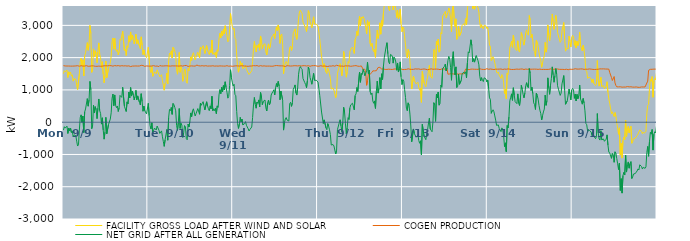
| Category | FACILITY GROSS LOAD AFTER WIND AND SOLAR | COGEN PRODUCTION | NET GRID AFTER ALL GENERATION |
|---|---|---|---|
|  Mon  9/9 | 1505 | 1752 | -247 |
|  Mon  9/9 | 1597 | 1737 | -140 |
|  Mon  9/9 | 1559 | 1742 | -183 |
|  Mon  9/9 | 1580 | 1735 | -155 |
|  Mon  9/9 | 1617 | 1740 | -123 |
|  Mon  9/9 | 1384 | 1734 | -350 |
|  Mon  9/9 | 1560 | 1740 | -180 |
|  Mon  9/9 | 1480 | 1748 | -268 |
|  Mon  9/9 | 1556 | 1737 | -181 |
|  Mon  9/9 | 1427 | 1748 | -321 |
|  Mon  9/9 | 1467 | 1737 | -270 |
|  Mon  9/9 | 1272 | 1729 | -457 |
|  Mon  9/9 | 1346 | 1739 | -393 |
|  Mon  9/9 | 1343 | 1721 | -378 |
|  Mon  9/9 | 1325 | 1743 | -418 |
|  Mon  9/9 | 1149 | 1737 | -588 |
|  Mon  9/9 | 1011 | 1750 | -739 |
|  Mon  9/9 | 1038 | 1740 | -702 |
|  Mon  9/9 | 1491 | 1734 | -243 |
|  Mon  9/9 | 1881 | 1737 | 144 |
|  Mon  9/9 | 1977 | 1750 | 227 |
|  Mon  9/9 | 1741 | 1746 | -5 |
|  Mon  9/9 | 1930 | 1738 | 192 |
|  Mon  9/9 | 1431 | 1752 | -321 |
|  Mon  9/9 | 2055 | 1740 | 315 |
|  Mon  9/9 | 2149 | 1740 | 409 |
|  Mon  9/9 | 2135 | 1752 | 383 |
|  Mon  9/9 | 2465 | 1736 | 729 |
|  Mon  9/9 | 2228 | 1732 | 496 |
|  Mon  9/9 | 2437 | 1739 | 698 |
|  Mon  9/9 | 2999 | 1736 | 1263 |
|  Mon  9/9 | 2750 | 1746 | 1004 |
|  Mon  9/9 | 1543 | 1746 | -203 |
|  Mon  9/9 | 1649 | 1741 | -92 |
|  Mon  9/9 | 2272 | 1744 | 528 |
|  Mon  9/9 | 2021 | 1737 | 284 |
|  Mon  9/9 | 2213 | 1732 | 481 |
|  Mon  9/9 | 2127 | 1741 | 386 |
|  Mon  9/9 | 1841 | 1731 | 110 |
|  Mon  9/9 | 2187 | 1751 | 436 |
|  Mon  9/9 | 2457 | 1738 | 719 |
|  Mon  9/9 | 2112 | 1756 | 356 |
|  Mon  9/9 | 2006 | 1733 | 273 |
|  Mon  9/9 | 1687 | 1747 | -60 |
|  Mon  9/9 | 1873 | 1737 | 136 |
|  Mon  9/9 | 1488 | 1735 | -247 |
|  Mon  9/9 | 1221 | 1747 | -526 |
|  Mon  9/9 | 1447 | 1754 | -307 |
|  Mon  9/9 | 1897 | 1748 | 149 |
|  Mon  9/9 | 1380 | 1740 | -360 |
|  Mon  9/9 | 1391 | 1746 | -355 |
|  Mon  9/9 | 1670 | 1741 | -71 |
|  Mon  9/9 | 1684 | 1753 | -69 |
|  Mon  9/9 | 1839 | 1742 | 97 |
|  Mon  9/9 | 2042 | 1751 | 291 |
|  Mon  9/9 | 2497 | 1755 | 742 |
|  Mon  9/9 | 2607 | 1736 | 871 |
|  Mon  9/9 | 2261 | 1750 | 511 |
|  Mon  9/9 | 2598 | 1754 | 844 |
|  Mon  9/9 | 2259 | 1737 | 522 |
|  Mon  9/9 | 2195 | 1745 | 450 |
|  Mon  9/9 | 2244 | 1742 | 502 |
|  Mon  9/9 | 2084 | 1753 | 331 |
|  Mon  9/9 | 2188 | 1740 | 448 |
|  Mon  9/9 | 2568 | 1739 | 829 |
|  Mon  9/9 | 2536 | 1733 | 803 |
|  Mon  9/9 | 2519 | 1751 | 768 |
|  Mon  9/9 | 2822 | 1742 | 1080 |
|  Mon  9/9 | 2830 | 1743 | 1087 |
|  Mon  9/9 | 2225 | 1735 | 490 |
|  Mon  9/9 | 2260 | 1747 | 513 |
|  Mon  9/9 | 2067 | 1736 | 331 |
|  Mon  9/9 | 2368 | 1739 | 629 |
|  Mon  9/9 | 2313 | 1745 | 568 |
|  Mon  9/9 | 2678 | 1745 | 933 |
|  Mon  9/9 | 2482 | 1732 | 750 |
|  Mon  9/9 | 2796 | 1723 | 1073 |
|  Mon  9/9 | 2544 | 1735 | 809 |
|  Mon  9/9 | 2701 | 1738 | 963 |
|  Mon  9/9 | 2591 | 1748 | 843 |
|  Mon  9/9 | 2429 | 1740 | 689 |
|  Mon  9/9 | 2542 | 1747 | 795 |
|  Mon  9/9 | 2729 | 1742 | 987 |
|  Mon  9/9 | 2431 | 1737 | 694 |
|  Mon  9/9 | 2554 | 1739 | 815 |
|  Mon  9/9 | 2534 | 1740 | 794 |
|  Mon  9/9 | 2358 | 1741 | 617 |
|  Mon  9/9 | 2278 | 1744 | 534 |
|  Mon  9/9 | 2644 | 1762 | 882 |
|  Mon  9/9 | 2382 | 1740 | 642 |
|  Mon  9/9 | 2095 | 1756 | 339 |
|  Mon  9/9 | 2241 | 1743 | 498 |
|  Mon  9/9 | 2082 | 1729 | 353 |
|  Mon  9/9 | 2111 | 1736 | 375 |
|  Mon  9/9 | 2001 | 1743 | 258 |
|  Mon  9/9 | 2017 | 1745 | 272 |
|  Tue  9/10 | 2322 | 1738 | 584 |
|  Tue  9/10 | 1935 | 1733 | 202 |
|  Tue  9/10 | 1636 | 1737 | -101 |
|  Tue  9/10 | 1539 | 1748 | -209 |
|  Tue  9/10 | 1722 | 1740 | -18 |
|  Tue  9/10 | 1423 | 1744 | -321 |
|  Tue  9/10 | 1496 | 1752 | -256 |
|  Tue  9/10 | 1561 | 1743 | -182 |
|  Tue  9/10 | 1554 | 1736 | -182 |
|  Tue  9/10 | 1501 | 1744 | -243 |
|  Tue  9/10 | 1621 | 1740 | -119 |
|  Tue  9/10 | 1611 | 1744 | -133 |
|  Tue  9/10 | 1475 | 1722 | -247 |
|  Tue  9/10 | 1407 | 1755 | -348 |
|  Tue  9/10 | 1413 | 1732 | -319 |
|  Tue  9/10 | 1471 | 1741 | -270 |
|  Tue  9/10 | 1289 | 1740 | -451 |
|  Tue  9/10 | 1146 | 1741 | -595 |
|  Tue  9/10 | 991 | 1740 | -749 |
|  Tue  9/10 | 1200 | 1746 | -546 |
|  Tue  9/10 | 1234 | 1753 | -519 |
|  Tue  9/10 | 1521 | 1747 | -226 |
|  Tue  9/10 | 1188 | 1746 | -558 |
|  Tue  9/10 | 1886 | 1741 | 145 |
|  Tue  9/10 | 2140 | 1745 | 395 |
|  Tue  9/10 | 2096 | 1737 | 359 |
|  Tue  9/10 | 2212 | 1756 | 456 |
|  Tue  9/10 | 1988 | 1746 | 242 |
|  Tue  9/10 | 2323 | 1742 | 581 |
|  Tue  9/10 | 2284 | 1743 | 541 |
|  Tue  9/10 | 2193 | 1737 | 456 |
|  Tue  9/10 | 2096 | 1744 | 352 |
|  Tue  9/10 | 1632 | 1730 | -98 |
|  Tue  9/10 | 1487 | 1741 | -254 |
|  Tue  9/10 | 1734 | 1740 | -6 |
|  Tue  9/10 | 2161 | 1738 | 423 |
|  Tue  9/10 | 1547 | 1739 | -192 |
|  Tue  9/10 | 1713 | 1748 | -35 |
|  Tue  9/10 | 1640 | 1733 | -93 |
|  Tue  9/10 | 1267 | 1738 | -471 |
|  Tue  9/10 | 1408 | 1738 | -330 |
|  Tue  9/10 | 1649 | 1754 | -105 |
|  Tue  9/10 | 1582 | 1728 | -146 |
|  Tue  9/10 | 1251 | 1758 | -507 |
|  Tue  9/10 | 1205 | 1751 | -546 |
|  Tue  9/10 | 1665 | 1726 | -61 |
|  Tue  9/10 | 1592 | 1739 | -147 |
|  Tue  9/10 | 1755 | 1740 | 15 |
|  Tue  9/10 | 2022 | 1736 | 286 |
|  Tue  9/10 | 1914 | 1744 | 170 |
|  Tue  9/10 | 2092 | 1750 | 342 |
|  Tue  9/10 | 2153 | 1739 | 414 |
|  Tue  9/10 | 2127 | 1734 | 393 |
|  Tue  9/10 | 1929 | 1738 | 191 |
|  Tue  9/10 | 2019 | 1757 | 262 |
|  Tue  9/10 | 2026 | 1769 | 257 |
|  Tue  9/10 | 2167 | 1745 | 422 |
|  Tue  9/10 | 2186 | 1748 | 438 |
|  Tue  9/10 | 1993 | 1748 | 245 |
|  Tue  9/10 | 2331 | 1742 | 589 |
|  Tue  9/10 | 2262 | 1736 | 526 |
|  Tue  9/10 | 2332 | 1751 | 581 |
|  Tue  9/10 | 2371 | 1736 | 635 |
|  Tue  9/10 | 2368 | 1740 | 628 |
|  Tue  9/10 | 2126 | 1746 | 380 |
|  Tue  9/10 | 2152 | 1750 | 402 |
|  Tue  9/10 | 2372 | 1740 | 632 |
|  Tue  9/10 | 2237 | 1738 | 499 |
|  Tue  9/10 | 2162 | 1744 | 418 |
|  Tue  9/10 | 2096 | 1741 | 355 |
|  Tue  9/10 | 2240 | 1735 | 505 |
|  Tue  9/10 | 2155 | 1740 | 415 |
|  Tue  9/10 | 2546 | 1743 | 803 |
|  Tue  9/10 | 2104 | 1748 | 356 |
|  Tue  9/10 | 2148 | 1735 | 413 |
|  Tue  9/10 | 2094 | 1737 | 357 |
|  Tue  9/10 | 2175 | 1742 | 433 |
|  Tue  9/10 | 2006 | 1741 | 265 |
|  Tue  9/10 | 2245 | 1739 | 506 |
|  Tue  9/10 | 2195 | 1737 | 458 |
|  Tue  9/10 | 2583 | 1739 | 844 |
|  Tue  9/10 | 2753 | 1744 | 1009 |
|  Tue  9/10 | 2614 | 1730 | 884 |
|  Tue  9/10 | 2820 | 1741 | 1079 |
|  Tue  9/10 | 2682 | 1740 | 942 |
|  Tue  9/10 | 2873 | 1738 | 1135 |
|  Tue  9/10 | 2743 | 1743 | 1000 |
|  Tue  9/10 | 2989 | 1737 | 1252 |
|  Tue  9/10 | 2812 | 1735 | 1077 |
|  Tue  9/10 | 2679 | 1751 | 928 |
|  Tue  9/10 | 2491 | 1747 | 744 |
|  Tue  9/10 | 2532 | 1734 | 798 |
|  Tue  9/10 | 2879 | 1747 | 1132 |
|  Tue  9/10 | 3366 | 1741 | 1625 |
|  Tue  9/10 | 3131 | 1754 | 1377 |
|  Tue  9/10 | 2972 | 1731 | 1241 |
|  Wed  9/11 | 2872 | 1752 | 1120 |
|  Wed  9/11 | 2914 | 1739 | 1175 |
|  Wed  9/11 | 2602 | 1739 | 863 |
|  Wed  9/11 | 2565 | 1746 | 819 |
|  Wed  9/11 | 2076 | 1745 | 331 |
|  Wed  9/11 | 1701 | 1744 | -43 |
|  Wed  9/11 | 1550 | 1743 | -193 |
|  Wed  9/11 | 1679 | 1739 | -60 |
|  Wed  9/11 | 1886 | 1737 | 149 |
|  Wed  9/11 | 1757 | 1746 | 11 |
|  Wed  9/11 | 1838 | 1744 | 94 |
|  Wed  9/11 | 1663 | 1747 | -84 |
|  Wed  9/11 | 1648 | 1747 | -99 |
|  Wed  9/11 | 1697 | 1740 | -43 |
|  Wed  9/11 | 1759 | 1742 | 17 |
|  Wed  9/11 | 1640 | 1736 | -96 |
|  Wed  9/11 | 1615 | 1736 | -121 |
|  Wed  9/11 | 1526 | 1731 | -205 |
|  Wed  9/11 | 1478 | 1751 | -273 |
|  Wed  9/11 | 1516 | 1739 | -223 |
|  Wed  9/11 | 1533 | 1742 | -209 |
|  Wed  9/11 | 1590 | 1741 | -151 |
|  Wed  9/11 | 1882 | 1738 | 144 |
|  Wed  9/11 | 2287 | 1752 | 535 |
|  Wed  9/11 | 2500 | 1735 | 765 |
|  Wed  9/11 | 2300 | 1747 | 553 |
|  Wed  9/11 | 2174 | 1741 | 433 |
|  Wed  9/11 | 2379 | 1754 | 625 |
|  Wed  9/11 | 2313 | 1728 | 585 |
|  Wed  9/11 | 2424 | 1734 | 690 |
|  Wed  9/11 | 2231 | 1758 | 473 |
|  Wed  9/11 | 2671 | 1752 | 919 |
|  Wed  9/11 | 2533 | 1753 | 780 |
|  Wed  9/11 | 2280 | 1738 | 542 |
|  Wed  9/11 | 2391 | 1749 | 642 |
|  Wed  9/11 | 2390 | 1745 | 645 |
|  Wed  9/11 | 2432 | 1745 | 687 |
|  Wed  9/11 | 2179 | 1737 | 442 |
|  Wed  9/11 | 2081 | 1735 | 346 |
|  Wed  9/11 | 2342 | 1738 | 604 |
|  Wed  9/11 | 2427 | 1742 | 685 |
|  Wed  9/11 | 2275 | 1738 | 537 |
|  Wed  9/11 | 2331 | 1751 | 580 |
|  Wed  9/11 | 2577 | 1735 | 842 |
|  Wed  9/11 | 2646 | 1743 | 903 |
|  Wed  9/11 | 2682 | 1735 | 947 |
|  Wed  9/11 | 2736 | 1732 | 1004 |
|  Wed  9/11 | 2591 | 1749 | 842 |
|  Wed  9/11 | 2813 | 1742 | 1071 |
|  Wed  9/11 | 2953 | 1755 | 1198 |
|  Wed  9/11 | 2837 | 1748 | 1089 |
|  Wed  9/11 | 3013 | 1750 | 1263 |
|  Wed  9/11 | 2859 | 1738 | 1121 |
|  Wed  9/11 | 2439 | 1745 | 694 |
|  Wed  9/11 | 2697 | 1734 | 963 |
|  Wed  9/11 | 2734 | 1746 | 988 |
|  Wed  9/11 | 2410 | 1732 | 678 |
|  Wed  9/11 | 1496 | 1742 | -246 |
|  Wed  9/11 | 1729 | 1742 | -13 |
|  Wed  9/11 | 1824 | 1724 | 100 |
|  Wed  9/11 | 1877 | 1734 | 143 |
|  Wed  9/11 | 1817 | 1752 | 65 |
|  Wed  9/11 | 1772 | 1734 | 38 |
|  Wed  9/11 | 1781 | 1745 | 36 |
|  Wed  9/11 | 2317 | 1741 | 576 |
|  Wed  9/11 | 2356 | 1739 | 617 |
|  Wed  9/11 | 2222 | 1732 | 490 |
|  Wed  9/11 | 2346 | 1743 | 603 |
|  Wed  9/11 | 2772 | 1752 | 1020 |
|  Wed  9/11 | 2827 | 1750 | 1077 |
|  Wed  9/11 | 2891 | 1736 | 1155 |
|  Wed  9/11 | 2656 | 1749 | 907 |
|  Wed  9/11 | 2565 | 1725 | 840 |
|  Wed  9/11 | 2816 | 1743 | 1073 |
|  Wed  9/11 | 3225 | 1739 | 1486 |
|  Wed  9/11 | 3415 | 1751 | 1664 |
|  Wed  9/11 | 3468 | 1747 | 1721 |
|  Wed  9/11 | 3408 | 1740 | 1668 |
|  Wed  9/11 | 3368 | 1732 | 1636 |
|  Wed  9/11 | 3103 | 1750 | 1353 |
|  Wed  9/11 | 3082 | 1744 | 1338 |
|  Wed  9/11 | 2978 | 1751 | 1227 |
|  Wed  9/11 | 2904 | 1740 | 1164 |
|  Wed  9/11 | 2809 | 1741 | 1068 |
|  Wed  9/11 | 3035 | 1742 | 1293 |
|  Wed  9/11 | 3458 | 1750 | 1708 |
|  Wed  9/11 | 3381 | 1753 | 1628 |
|  Wed  9/11 | 3116 | 1732 | 1384 |
|  Wed  9/11 | 3020 | 1735 | 1285 |
|  Wed  9/11 | 2925 | 1749 | 1176 |
|  Wed  9/11 | 3110 | 1747 | 1363 |
|  Wed  9/11 | 3266 | 1752 | 1514 |
|  Wed  9/11 | 3040 | 1743 | 1297 |
|  Wed  9/11 | 3043 | 1753 | 1290 |
|  Wed  9/11 | 3042 | 1743 | 1299 |
|  Wed  9/11 | 3060 | 1736 | 1324 |
|  Thu  9/12 | 2981 | 1738 | 1243 |
|  Thu  9/12 | 2775 | 1734 | 1041 |
|  Thu  9/12 | 2560 | 1741 | 819 |
|  Thu  9/12 | 2590 | 1750 | 840 |
|  Thu  9/12 | 2040 | 1726 | 314 |
|  Thu  9/12 | 2034 | 1737 | 297 |
|  Thu  9/12 | 1693 | 1734 | -41 |
|  Thu  9/12 | 1812 | 1741 | 71 |
|  Thu  9/12 | 1813 | 1743 | 70 |
|  Thu  9/12 | 1559 | 1735 | -176 |
|  Thu  9/12 | 1506 | 1740 | -234 |
|  Thu  9/12 | 1680 | 1724 | -44 |
|  Thu  9/12 | 1615 | 1741 | -126 |
|  Thu  9/12 | 1503 | 1740 | -237 |
|  Thu  9/12 | 1358 | 1742 | -384 |
|  Thu  9/12 | 1029 | 1737 | -708 |
|  Thu  9/12 | 1046 | 1740 | -694 |
|  Thu  9/12 | 1057 | 1750 | -693 |
|  Thu  9/12 | 990 | 1727 | -737 |
|  Thu  9/12 | 873 | 1735 | -862 |
|  Thu  9/12 | 760 | 1746 | -986 |
|  Thu  9/12 | 892 | 1764 | -872 |
|  Thu  9/12 | 1515 | 1745 | -230 |
|  Thu  9/12 | 1497 | 1749 | -252 |
|  Thu  9/12 | 1722 | 1743 | -21 |
|  Thu  9/12 | 1811 | 1737 | 74 |
|  Thu  9/12 | 1623 | 1739 | -116 |
|  Thu  9/12 | 1440 | 1740 | -300 |
|  Thu  9/12 | 1725 | 1750 | -25 |
|  Thu  9/12 | 2194 | 1732 | 462 |
|  Thu  9/12 | 2053 | 1736 | 317 |
|  Thu  9/12 | 1713 | 1746 | -33 |
|  Thu  9/12 | 1394 | 1752 | -358 |
|  Thu  9/12 | 1567 | 1743 | -176 |
|  Thu  9/12 | 1877 | 1737 | 140 |
|  Thu  9/12 | 1826 | 1744 | 82 |
|  Thu  9/12 | 2177 | 1741 | 436 |
|  Thu  9/12 | 2269 | 1732 | 537 |
|  Thu  9/12 | 2276 | 1736 | 540 |
|  Thu  9/12 | 2326 | 1739 | 587 |
|  Thu  9/12 | 2303 | 1743 | 560 |
|  Thu  9/12 | 2131 | 1748 | 383 |
|  Thu  9/12 | 2559 | 1736 | 823 |
|  Thu  9/12 | 2629 | 1752 | 877 |
|  Thu  9/12 | 2819 | 1745 | 1074 |
|  Thu  9/12 | 2687 | 1736 | 951 |
|  Thu  9/12 | 2700 | 1750 | 950 |
|  Thu  9/12 | 3285 | 1731 | 1554 |
|  Thu  9/12 | 2981 | 1745 | 1236 |
|  Thu  9/12 | 3253 | 1744 | 1509 |
|  Thu  9/12 | 3221 | 1744 | 1477 |
|  Thu  9/12 | 3275 | 1639 | 1636 |
|  Thu  9/12 | 3209 | 1648 | 1561 |
|  Thu  9/12 | 3074 | 1640 | 1434 |
|  Thu  9/12 | 2930 | 1517 | 1413 |
|  Thu  9/12 | 2737 | 1143 | 1594 |
|  Thu  9/12 | 3147 | 1288 | 1859 |
|  Thu  9/12 | 3000 | 1494 | 1506 |
|  Thu  9/12 | 3108 | 1492 | 1616 |
|  Thu  9/12 | 2434 | 1489 | 945 |
|  Thu  9/12 | 2346 | 1494 | 852 |
|  Thu  9/12 | 2447 | 1541 | 906 |
|  Thu  9/12 | 2246 | 1590 | 656 |
|  Thu  9/12 | 2183 | 1597 | 586 |
|  Thu  9/12 | 2249 | 1590 | 659 |
|  Thu  9/12 | 2009 | 1583 | 426 |
|  Thu  9/12 | 2552 | 1596 | 956 |
|  Thu  9/12 | 2856 | 1584 | 1272 |
|  Thu  9/12 | 2595 | 1694 | 901 |
|  Thu  9/12 | 2735 | 1683 | 1052 |
|  Thu  9/12 | 3080 | 1698 | 1382 |
|  Thu  9/12 | 2726 | 1696 | 1030 |
|  Thu  9/12 | 3147 | 1647 | 1500 |
|  Thu  9/12 | 2973 | 1649 | 1324 |
|  Thu  9/12 | 3381 | 1649 | 1732 |
|  Thu  9/12 | 3634 | 1632 | 2002 |
|  Thu  9/12 | 3651 | 1635 | 2016 |
|  Thu  9/12 | 3977 | 1644 | 2333 |
|  Thu  9/12 | 4098 | 1635 | 2463 |
|  Thu  9/12 | 3771 | 1651 | 2120 |
|  Thu  9/12 | 3504 | 1643 | 1861 |
|  Thu  9/12 | 3447 | 1639 | 1808 |
|  Thu  9/12 | 3737 | 1637 | 2100 |
|  Thu  9/12 | 3709 | 1639 | 2070 |
|  Thu  9/12 | 3690 | 1633 | 2057 |
|  Thu  9/12 | 3476 | 1646 | 1830 |
|  Thu  9/12 | 3660 | 1645 | 2015 |
|  Thu  9/12 | 3621 | 1648 | 1973 |
|  Thu  9/12 | 3514 | 1649 | 1865 |
|  Thu  9/12 | 3244 | 1634 | 1610 |
|  Thu  9/12 | 3470 | 1636 | 1834 |
|  Thu  9/12 | 3203 | 1649 | 1554 |
|  Thu  9/12 | 3288 | 1640 | 1648 |
|  Thu  9/12 | 3508 | 1640 | 1868 |
|  Thu  9/12 | 3053 | 1648 | 1405 |
|  Thu  9/12 | 2803 | 1638 | 1165 |
|  Fri  9/13 | 2947 | 1628 | 1319 |
|  Fri  9/13 | 2907 | 1637 | 1270 |
|  Fri  9/13 | 2642 | 1634 | 1008 |
|  Fri  9/13 | 2396 | 1634 | 762 |
|  Fri  9/13 | 2071 | 1636 | 435 |
|  Fri  9/13 | 1990 | 1633 | 357 |
|  Fri  9/13 | 2252 | 1653 | 599 |
|  Fri  9/13 | 2171 | 1643 | 528 |
|  Fri  9/13 | 1892 | 1641 | 251 |
|  Fri  9/13 | 1507 | 1626 | -119 |
|  Fri  9/13 | 1029 | 1636 | -607 |
|  Fri  9/13 | 1055 | 1636 | -581 |
|  Fri  9/13 | 1427 | 1637 | -210 |
|  Fri  9/13 | 1290 | 1643 | -353 |
|  Fri  9/13 | 1320 | 1651 | -331 |
|  Fri  9/13 | 1185 | 1651 | -466 |
|  Fri  9/13 | 1191 | 1646 | -455 |
|  Fri  9/13 | 1239 | 1640 | -401 |
|  Fri  9/13 | 1080 | 1650 | -570 |
|  Fri  9/13 | 989 | 1643 | -654 |
|  Fri  9/13 | 1060 | 1636 | -576 |
|  Fri  9/13 | 616 | 1629 | -1013 |
|  Fri  9/13 | 1574 | 1642 | -68 |
|  Fri  9/13 | 1578 | 1639 | -61 |
|  Fri  9/13 | 1215 | 1649 | -434 |
|  Fri  9/13 | 1198 | 1641 | -443 |
|  Fri  9/13 | 1097 | 1639 | -542 |
|  Fri  9/13 | 1284 | 1636 | -352 |
|  Fri  9/13 | 1396 | 1624 | -228 |
|  Fri  9/13 | 1612 | 1638 | -26 |
|  Fri  9/13 | 1761 | 1639 | 122 |
|  Fri  9/13 | 1429 | 1641 | -212 |
|  Fri  9/13 | 1399 | 1653 | -254 |
|  Fri  9/13 | 1360 | 1656 | -296 |
|  Fri  9/13 | 1642 | 1640 | 2 |
|  Fri  9/13 | 2252 | 1648 | 604 |
|  Fri  9/13 | 2184 | 1644 | 540 |
|  Fri  9/13 | 1661 | 1636 | 25 |
|  Fri  9/13 | 2510 | 1645 | 865 |
|  Fri  9/13 | 2398 | 1641 | 757 |
|  Fri  9/13 | 2574 | 1642 | 932 |
|  Fri  9/13 | 2170 | 1644 | 526 |
|  Fri  9/13 | 2206 | 1629 | 577 |
|  Fri  9/13 | 2775 | 1631 | 1144 |
|  Fri  9/13 | 2731 | 1647 | 1084 |
|  Fri  9/13 | 3295 | 1636 | 1659 |
|  Fri  9/13 | 3319 | 1656 | 1663 |
|  Fri  9/13 | 3379 | 1649 | 1730 |
|  Fri  9/13 | 3436 | 1637 | 1799 |
|  Fri  9/13 | 3236 | 1649 | 1587 |
|  Fri  9/13 | 3329 | 1649 | 1680 |
|  Fri  9/13 | 3404 | 1487 | 1917 |
|  Fri  9/13 | 3539 | 1499 | 2040 |
|  Fri  9/13 | 3447 | 1494 | 1953 |
|  Fri  9/13 | 3181 | 1491 | 1690 |
|  Fri  9/13 | 2804 | 1505 | 1299 |
|  Fri  9/13 | 3494 | 1506 | 1988 |
|  Fri  9/13 | 3676 | 1492 | 2184 |
|  Fri  9/13 | 3225 | 1493 | 1732 |
|  Fri  9/13 | 2966 | 1501 | 1465 |
|  Fri  9/13 | 3203 | 1489 | 1714 |
|  Fri  9/13 | 2566 | 1493 | 1073 |
|  Fri  9/13 | 2614 | 1503 | 1111 |
|  Fri  9/13 | 2976 | 1491 | 1485 |
|  Fri  9/13 | 2667 | 1494 | 1173 |
|  Fri  9/13 | 2666 | 1496 | 1170 |
|  Fri  9/13 | 2790 | 1495 | 1295 |
|  Fri  9/13 | 2997 | 1495 | 1502 |
|  Fri  9/13 | 2990 | 1486 | 1504 |
|  Fri  9/13 | 3052 | 1501 | 1551 |
|  Fri  9/13 | 2995 | 1490 | 1505 |
|  Fri  9/13 | 3210 | 1648 | 1562 |
|  Fri  9/13 | 3021 | 1648 | 1373 |
|  Fri  9/13 | 3470 | 1633 | 1837 |
|  Fri  9/13 | 3838 | 1658 | 2180 |
|  Fri  9/13 | 3776 | 1629 | 2147 |
|  Fri  9/13 | 3787 | 1640 | 2147 |
|  Fri  9/13 | 4197 | 1644 | 2553 |
|  Fri  9/13 | 4024 | 1648 | 2376 |
|  Fri  9/13 | 3514 | 1644 | 1870 |
|  Fri  9/13 | 3613 | 1646 | 1967 |
|  Fri  9/13 | 3500 | 1640 | 1860 |
|  Fri  9/13 | 3501 | 1633 | 1868 |
|  Fri  9/13 | 3701 | 1639 | 2062 |
|  Fri  9/13 | 3672 | 1633 | 2039 |
|  Fri  9/13 | 3542 | 1637 | 1905 |
|  Fri  9/13 | 3411 | 1633 | 1778 |
|  Fri  9/13 | 3079 | 1655 | 1424 |
|  Fri  9/13 | 2928 | 1649 | 1279 |
|  Fri  9/13 | 3020 | 1640 | 1380 |
|  Fri  9/13 | 2949 | 1633 | 1316 |
|  Fri  9/13 | 2892 | 1634 | 1258 |
|  Fri  9/13 | 3005 | 1630 | 1375 |
|  Fri  9/13 | 2997 | 1634 | 1363 |
|  Fri  9/13 | 2982 | 1643 | 1339 |
|  Fri  9/13 | 2901 | 1657 | 1244 |
|  Sat  9/14 | 2949 | 1642 | 1307 |
|  Sat  9/14 | 2697 | 1639 | 1058 |
|  Sat  9/14 | 2386 | 1633 | 753 |
|  Sat  9/14 | 2355 | 1648 | 707 |
|  Sat  9/14 | 1906 | 1631 | 275 |
|  Sat  9/14 | 1992 | 1640 | 352 |
|  Sat  9/14 | 2029 | 1645 | 384 |
|  Sat  9/14 | 1955 | 1631 | 324 |
|  Sat  9/14 | 1837 | 1644 | 193 |
|  Sat  9/14 | 1705 | 1643 | 62 |
|  Sat  9/14 | 1552 | 1651 | -99 |
|  Sat  9/14 | 1519 | 1642 | -123 |
|  Sat  9/14 | 1555 | 1639 | -84 |
|  Sat  9/14 | 1449 | 1644 | -195 |
|  Sat  9/14 | 1404 | 1642 | -238 |
|  Sat  9/14 | 1356 | 1648 | -292 |
|  Sat  9/14 | 1476 | 1652 | -176 |
|  Sat  9/14 | 1406 | 1633 | -227 |
|  Sat  9/14 | 1221 | 1635 | -414 |
|  Sat  9/14 | 889 | 1645 | -756 |
|  Sat  9/14 | 1021 | 1661 | -640 |
|  Sat  9/14 | 727 | 1640 | -913 |
|  Sat  9/14 | 1526 | 1632 | -106 |
|  Sat  9/14 | 1475 | 1651 | -176 |
|  Sat  9/14 | 1801 | 1641 | 160 |
|  Sat  9/14 | 2301 | 1642 | 659 |
|  Sat  9/14 | 2410 | 1638 | 772 |
|  Sat  9/14 | 2511 | 1633 | 878 |
|  Sat  9/14 | 2319 | 1642 | 677 |
|  Sat  9/14 | 2700 | 1633 | 1067 |
|  Sat  9/14 | 2495 | 1652 | 843 |
|  Sat  9/14 | 2274 | 1638 | 636 |
|  Sat  9/14 | 2253 | 1626 | 627 |
|  Sat  9/14 | 2220 | 1645 | 575 |
|  Sat  9/14 | 2521 | 1644 | 877 |
|  Sat  9/14 | 2225 | 1639 | 586 |
|  Sat  9/14 | 2172 | 1655 | 517 |
|  Sat  9/14 | 2394 | 1645 | 749 |
|  Sat  9/14 | 2777 | 1636 | 1141 |
|  Sat  9/14 | 2675 | 1649 | 1026 |
|  Sat  9/14 | 2505 | 1640 | 865 |
|  Sat  9/14 | 2387 | 1632 | 755 |
|  Sat  9/14 | 2545 | 1644 | 901 |
|  Sat  9/14 | 2781 | 1646 | 1135 |
|  Sat  9/14 | 2862 | 1638 | 1224 |
|  Sat  9/14 | 2735 | 1638 | 1097 |
|  Sat  9/14 | 2694 | 1629 | 1065 |
|  Sat  9/14 | 3305 | 1643 | 1662 |
|  Sat  9/14 | 3162 | 1647 | 1515 |
|  Sat  9/14 | 2622 | 1641 | 981 |
|  Sat  9/14 | 2721 | 1641 | 1080 |
|  Sat  9/14 | 2528 | 1643 | 885 |
|  Sat  9/14 | 2239 | 1641 | 598 |
|  Sat  9/14 | 2189 | 1644 | 545 |
|  Sat  9/14 | 2025 | 1631 | 394 |
|  Sat  9/14 | 2537 | 1643 | 894 |
|  Sat  9/14 | 2484 | 1651 | 833 |
|  Sat  9/14 | 2350 | 1636 | 714 |
|  Sat  9/14 | 2159 | 1636 | 523 |
|  Sat  9/14 | 2016 | 1644 | 372 |
|  Sat  9/14 | 1916 | 1645 | 271 |
|  Sat  9/14 | 1702 | 1634 | 68 |
|  Sat  9/14 | 1845 | 1642 | 203 |
|  Sat  9/14 | 1953 | 1636 | 317 |
|  Sat  9/14 | 2048 | 1642 | 406 |
|  Sat  9/14 | 2472 | 1635 | 837 |
|  Sat  9/14 | 2170 | 1648 | 522 |
|  Sat  9/14 | 2304 | 1635 | 669 |
|  Sat  9/14 | 3014 | 1640 | 1374 |
|  Sat  9/14 | 2701 | 1636 | 1065 |
|  Sat  9/14 | 2517 | 1653 | 864 |
|  Sat  9/14 | 2792 | 1650 | 1142 |
|  Sat  9/14 | 3004 | 1648 | 1356 |
|  Sat  9/14 | 3354 | 1640 | 1714 |
|  Sat  9/14 | 3115 | 1648 | 1467 |
|  Sat  9/14 | 2876 | 1639 | 1237 |
|  Sat  9/14 | 3094 | 1652 | 1442 |
|  Sat  9/14 | 3308 | 1649 | 1659 |
|  Sat  9/14 | 3125 | 1638 | 1487 |
|  Sat  9/14 | 2775 | 1647 | 1128 |
|  Sat  9/14 | 2671 | 1648 | 1023 |
|  Sat  9/14 | 2657 | 1638 | 1019 |
|  Sat  9/14 | 2474 | 1644 | 830 |
|  Sat  9/14 | 2534 | 1636 | 898 |
|  Sat  9/14 | 2824 | 1638 | 1186 |
|  Sat  9/14 | 2850 | 1636 | 1214 |
|  Sat  9/14 | 3087 | 1643 | 1444 |
|  Sat  9/14 | 2620 | 1631 | 989 |
|  Sat  9/14 | 2200 | 1646 | 554 |
|  Sat  9/14 | 2205 | 1641 | 564 |
|  Sat  9/14 | 2302 | 1636 | 666 |
|  Sat  9/14 | 2267 | 1625 | 642 |
|  Sat  9/14 | 2667 | 1640 | 1027 |
|  Sat  9/14 | 2515 | 1642 | 873 |
|  Sat  9/14 | 2329 | 1640 | 689 |
|  Sat  9/14 | 2630 | 1637 | 993 |
|  Sun  9/15 | 2688 | 1642 | 1046 |
|  Sun  9/15 | 2650 | 1641 | 1009 |
|  Sun  9/15 | 2382 | 1644 | 738 |
|  Sun  9/15 | 2526 | 1656 | 870 |
|  Sun  9/15 | 2300 | 1642 | 658 |
|  Sun  9/15 | 2507 | 1645 | 862 |
|  Sun  9/15 | 2370 | 1645 | 725 |
|  Sun  9/15 | 2472 | 1645 | 827 |
|  Sun  9/15 | 2795 | 1645 | 1150 |
|  Sun  9/15 | 2371 | 1650 | 721 |
|  Sun  9/15 | 2352 | 1646 | 706 |
|  Sun  9/15 | 2207 | 1649 | 558 |
|  Sun  9/15 | 2382 | 1648 | 734 |
|  Sun  9/15 | 2231 | 1637 | 594 |
|  Sun  9/15 | 1984 | 1634 | 350 |
|  Sun  9/15 | 1606 | 1642 | -36 |
|  Sun  9/15 | 1572 | 1651 | -79 |
|  Sun  9/15 | 1361 | 1640 | -279 |
|  Sun  9/15 | 1368 | 1656 | -288 |
|  Sun  9/15 | 1400 | 1650 | -250 |
|  Sun  9/15 | 1400 | 1636 | -236 |
|  Sun  9/15 | 1337 | 1644 | -307 |
|  Sun  9/15 | 1230 | 1643 | -413 |
|  Sun  9/15 | 1332 | 1636 | -304 |
|  Sun  9/15 | 1203 | 1635 | -432 |
|  Sun  9/15 | 1191 | 1633 | -442 |
|  Sun  9/15 | 1134 | 1644 | -510 |
|  Sun  9/15 | 1189 | 1637 | -448 |
|  Sun  9/15 | 1909 | 1642 | 267 |
|  Sun  9/15 | 1308 | 1641 | -333 |
|  Sun  9/15 | 1117 | 1637 | -520 |
|  Sun  9/15 | 1097 | 1652 | -555 |
|  Sun  9/15 | 1389 | 1654 | -265 |
|  Sun  9/15 | 1105 | 1650 | -545 |
|  Sun  9/15 | 1076 | 1651 | -575 |
|  Sun  9/15 | 1131 | 1652 | -521 |
|  Sun  9/15 | 1041 | 1633 | -592 |
|  Sun  9/15 | 1038 | 1647 | -609 |
|  Sun  9/15 | 1115 | 1642 | -527 |
|  Sun  9/15 | 1253 | 1646 | -393 |
|  Sun  9/15 | 926 | 1633 | -707 |
|  Sun  9/15 | 720 | 1644 | -924 |
|  Sun  9/15 | 585 | 1540 | -955 |
|  Sun  9/15 | 567 | 1534 | -967 |
|  Sun  9/15 | 265 | 1385 | -1120 |
|  Sun  9/15 | 322 | 1291 | -969 |
|  Sun  9/15 | 314 | 1319 | -1005 |
|  Sun  9/15 | 172 | 1415 | -1243 |
|  Sun  9/15 | 299 | 1216 | -917 |
|  Sun  9/15 | 180 | 1138 | -958 |
|  Sun  9/15 | -36 | 1095 | -1131 |
|  Sun  9/15 | -187 | 1102 | -1289 |
|  Sun  9/15 | -374 | 1094 | -1468 |
|  Sun  9/15 | -175 | 1092 | -1267 |
|  Sun  9/15 | -1019 | 1097 | -2116 |
|  Sun  9/15 | -656 | 1093 | -1749 |
|  Sun  9/15 | -1113 | 1085 | -2198 |
|  Sun  9/15 | -565 | 1088 | -1653 |
|  Sun  9/15 | -460 | 1089 | -1549 |
|  Sun  9/15 | -541 | 1097 | -1638 |
|  Sun  9/15 | 65 | 1088 | -1023 |
|  Sun  9/15 | -444 | 1102 | -1546 |
|  Sun  9/15 | -209 | 1103 | -1312 |
|  Sun  9/15 | -130 | 1101 | -1231 |
|  Sun  9/15 | -332 | 1094 | -1426 |
|  Sun  9/15 | -189 | 1090 | -1279 |
|  Sun  9/15 | -125 | 1097 | -1222 |
|  Sun  9/15 | -654 | 1093 | -1747 |
|  Sun  9/15 | -607 | 1087 | -1694 |
|  Sun  9/15 | -508 | 1097 | -1605 |
|  Sun  9/15 | -516 | 1086 | -1602 |
|  Sun  9/15 | -495 | 1095 | -1590 |
|  Sun  9/15 | -455 | 1093 | -1548 |
|  Sun  9/15 | -416 | 1097 | -1513 |
|  Sun  9/15 | -367 | 1081 | -1448 |
|  Sun  9/15 | -386 | 1096 | -1482 |
|  Sun  9/15 | -241 | 1080 | -1321 |
|  Sun  9/15 | -230 | 1088 | -1318 |
|  Sun  9/15 | -281 | 1092 | -1373 |
|  Sun  9/15 | -360 | 1092 | -1452 |
|  Sun  9/15 | -307 | 1091 | -1398 |
|  Sun  9/15 | -339 | 1085 | -1424 |
|  Sun  9/15 | -339 | 1092 | -1431 |
|  Sun  9/15 | -290 | 1095 | -1385 |
|  Sun  9/15 | 276 | 1214 | -938 |
|  Sun  9/15 | 520 | 1272 | -752 |
|  Sun  9/15 | 552 | 1608 | -1056 |
|  Sun  9/15 | 1040 | 1634 | -594 |
|  Sun  9/15 | 1325 | 1637 | -312 |
|  Sun  9/15 | 1268 | 1639 | -371 |
|  Sun  9/15 | 1414 | 1639 | -225 |
|  Sun  9/15 | 773 | 1638 | -865 |
|  Sun  9/15 | 1274 | 1644 | -370 |
|  Sun  9/15 | 1351 | 1648 | -297 |
|  Sun  9/15 | 1316 | 1644 | -328 |
|  Sun  9/15 | 1552 | 1650 | -98 |